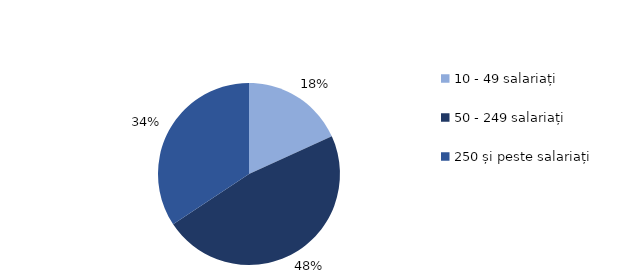
| Category | Series 0 |
|---|---|
| 10 - 49 salariați | 0.182 |
| 50 - 249 salariați | 0.475 |
| 250 și peste salariați | 0.343 |